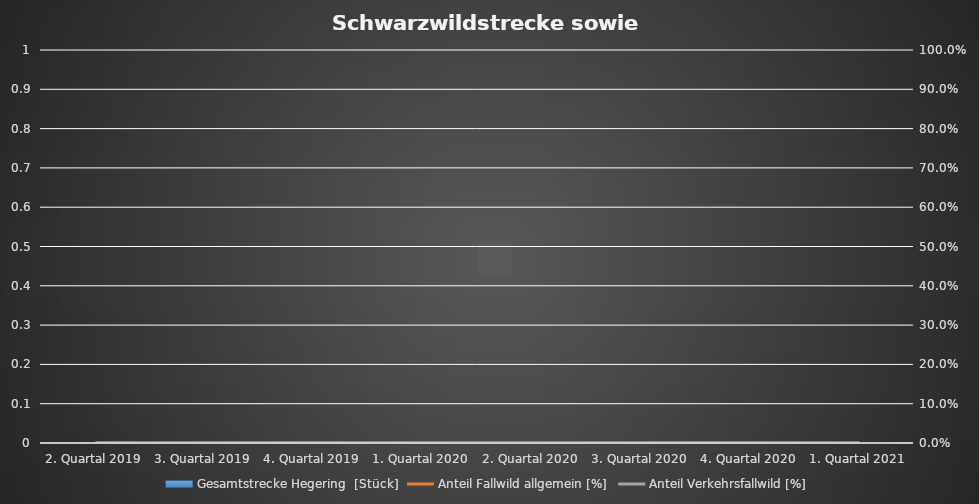
| Category | Gesamtstrecke Hegering  [Stück] |
|---|---|
| 2. Quartal 2019 | 0 |
| 3. Quartal 2019 | 0 |
| 4. Quartal 2019 | 0 |
| 1. Quartal 2020 | 0 |
| 2. Quartal 2020 | 0 |
| 3. Quartal 2020 | 0 |
| 4. Quartal 2020 | 0 |
| 1. Quartal 2021 | 0 |